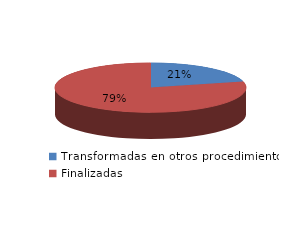
| Category | Series 0 |
|---|---|
| Transformadas en otros procedimientos | 1418 |
| Finalizadas | 5346 |